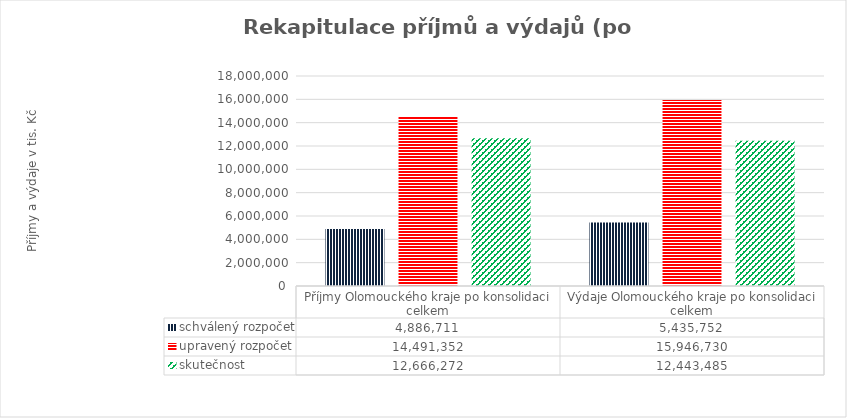
| Category | schválený rozpočet | upravený rozpočet | skutečnost |
|---|---|---|---|
| Příjmy Olomouckého kraje po konsolidaci celkem | 4886711 | 14491352 | 12666272 |
| Výdaje Olomouckého kraje po konsolidaci celkem | 5435752 | 15946730 | 12443485 |